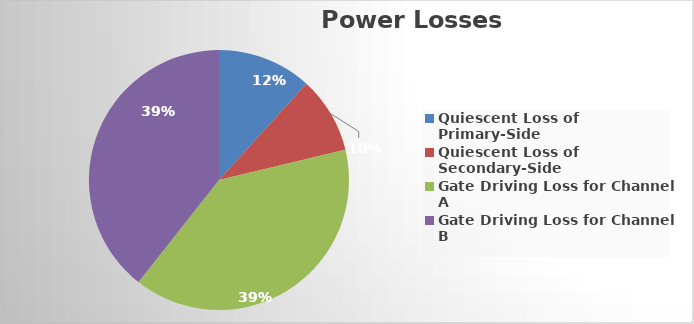
| Category | Series 0 | Series 1 |
|---|---|---|
| Quiescent Loss of Primary-Side | 36.96 |  |
| Quiescent Loss of Secondary-Side  | 30.02 |  |
| Gate Driving Loss for Channel A | 124.015 |  |
| Gate Driving Loss for Channel B | 124.015 |  |